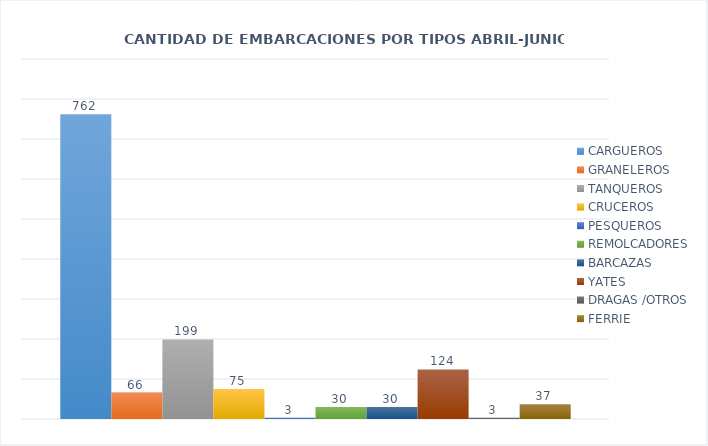
| Category | CARGUEROS | GRANELEROS | TANQUEROS | CRUCEROS | PESQUEROS | REMOLCADORES | BARCAZAS | YATES | DRAGAS /OTROS | FERRIE |
|---|---|---|---|---|---|---|---|---|---|---|
| 0 | 762 | 66 | 199 | 75 | 3 | 30 | 30 | 124 | 3 | 37 |